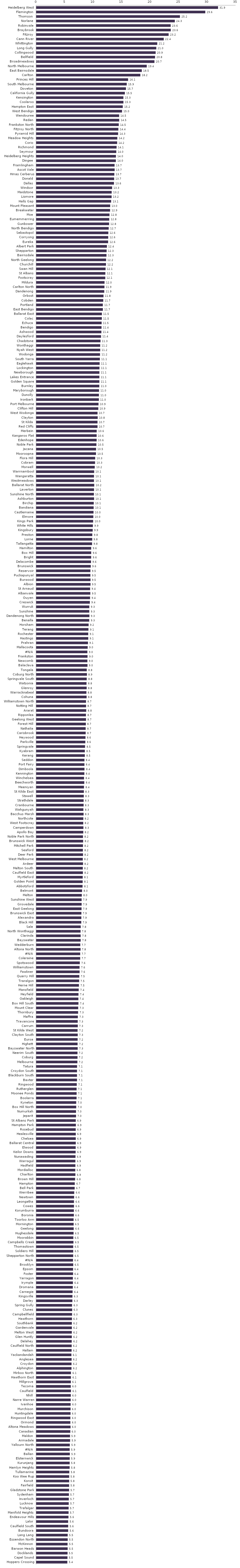
| Category | Series 0 |
|---|---|
| Heidelberg West | 31.882 |
| Flemington | 29.642 |
| Thomson  | 25.197 |
| Norlane | 24.297 |
| Robinvale | 23.571 |
| Braybrook | 23.585 |
| Fitzroy | 23.211 |
| Cann River | 22.353 |
| Whittington | 21.214 |
| Long Gully | 21.045 |
| Collingwood | 20.932 |
| Bellfield | 20.828 |
| Broadmeadows | 20.719 |
| North Melbourne | 19.368 |
| East Bairnsdale | 18.504 |
| Carlton | 18.247 |
| Princes Hill | 16.103 |
| South Melbourne | 15.857 |
| Doveton | 15.722 |
| California Gully | 15.53 |
| Kensington | 15.274 |
| Coolaroo | 15.278 |
| Hampton East | 15.165 |
| West Bendigo | 15.033 |
| Wendouree | 14.53 |
| Redan | 14.538 |
| Frankston North | 14.461 |
| Fitzroy North | 14.388 |
| Pyramid Hill | 14.348 |
| Meadow Heights | 14.203 |
| Corio | 14.177 |
| Richmond | 14.077 |
| Seymour | 14.028 |
| Heidelberg Heights | 13.963 |
| Dingee | 13.953 |
| Framlingham | 13.725 |
| Ascot Vale | 13.741 |
| Hmas Cerberus | 13.684 |
| Donald | 13.652 |
| Dallas | 13.62 |
| Windsor | 13.294 |
| Maidstone | 13.217 |
| Lismore | 13.208 |
| Halls Gap | 13.122 |
| Mount Pleasant | 12.955 |
| Breakwater | 12.939 |
| Moe | 12.833 |
| Eumemmerring | 12.792 |
| Gunbower | 12.766 |
| North Bendigo | 12.694 |
| Sebastopol | 12.63 |
| Corryong | 12.611 |
| Eureka | 12.595 |
| Albert Park | 12.381 |
| Shepparton | 12.33 |
| Bairnsdale | 12.304 |
| North Geelong | 12.238 |
| Churchill | 12.218 |
| Swan Hill | 12.144 |
| St Albans | 12.107 |
| Footscray | 12.096 |
| Mildura | 11.965 |
| Carlton North | 11.949 |
| Dandenong | 11.915 |
| Orbost | 11.783 |
| Cobden | 11.74 |
| Portland | 11.663 |
| East Bendigo | 11.674 |
| Ballarat East | 11.502 |
| Colac | 11.492 |
| Echuca | 11.455 |
| Bendigo | 11.438 |
| Ashwood | 11.411 |
| Daylesford | 11.351 |
| Chadstone | 11.259 |
| Wonthaggi | 11.206 |
| Nyah West | 11.207 |
| Wodonga | 11.173 |
| South Yarra | 11.147 |
| Eaglehawk | 11.106 |
| Lockington | 11.075 |
| Newborough | 11.066 |
| Lakes Entrance | 11.059 |
| Golden Square | 11.057 |
| Burnley | 11.045 |
| Maryborough | 10.999 |
| Dunolly | 10.981 |
| Ironbark | 10.973 |
| Port Melbourne | 10.907 |
| Clifton Hill | 10.869 |
| West Wodonga | 10.734 |
| Clayton | 10.763 |
| St Kilda | 10.73 |
| Red Cliffs | 10.733 |
| Merbein | 10.588 |
| Kangaroo Flat | 10.58 |
| Edenhope | 10.579 |
| Noble Park | 10.54 |
| Jacana | 10.476 |
| Mooroopna | 10.466 |
| Flora Hill | 10.323 |
| Cobram | 10.305 |
| Morwell | 10.247 |
| Warrnambool | 10.147 |
| Wangaratta | 10.117 |
| Westmeadows | 10.113 |
| Ballarat North | 10.156 |
| Laverton | 10.123 |
| Sunshine North | 10.1 |
| Ashburton | 10.134 |
| Birchip | 10.072 |
| Bandiana | 10.056 |
| Castlemaine | 10.032 |
| Elmore | 10 |
| Kings Park | 9.965 |
| White Hills | 9.918 |
| Kingsbury | 9.886 |
| Preston | 9.816 |
| Lorne | 9.807 |
| Tallangatta | 9.778 |
| Hamilton | 9.622 |
| Box Hill | 9.622 |
| Bright | 9.619 |
| Delacombe | 9.592 |
| Brunswick | 9.551 |
| Reservoir | 9.486 |
| Puckapunyal | 9.483 |
| Burwood | 9.506 |
| Albion | 9.505 |
| St Arnaud | 9.436 |
| Albanvale | 9.47 |
| Ouyen | 9.426 |
| Creswick | 9.389 |
| Wurruk | 9.291 |
| Sunshine | 9.286 |
| Dandenong North | 9.312 |
| Benalla | 9.28 |
| Horsham | 9.173 |
| Terang | 9.142 |
| Rochester | 9.105 |
| Hastings | 9.109 |
| Prahran | 9.06 |
| Mallacoota | 9.006 |
| #N/A | 8.952 |
| Frankston | 8.982 |
| Newcomb | 8.955 |
| Balaclava | 8.974 |
| Tongala | 8.844 |
| Coburg North | 8.877 |
| Springvale South | 8.84 |
| Watsonia | 8.801 |
| Glenroy | 8.829 |
| Warracknabeal | 8.782 |
| Cohuna | 8.818 |
| Williamstown North | 8.716 |
| Notting Hill | 8.725 |
| Ararat | 8.754 |
| Ripponlea | 8.702 |
| Geelong West | 8.715 |
| Forest Hill | 8.686 |
| Nathalia | 8.653 |
| Carisbrook | 8.656 |
| Heywood | 8.623 |
| Parkville | 8.595 |
| Springvale | 8.549 |
| Kyabram | 8.509 |
| Kerang | 8.508 |
| Seddon | 8.441 |
| Port Fairy | 8.439 |
| Dimboola | 8.447 |
| Kennington | 8.428 |
| Winchelsea | 8.369 |
| Beechworth | 8.412 |
| Meeniyan | 8.36 |
| St Kilda East | 8.339 |
| Stawell | 8.324 |
| Strathdale | 8.294 |
| Cranbourne | 8.295 |
| Wahgunyah | 8.255 |
| Bacchus Marsh | 8.291 |
| Northcote | 8.248 |
| West Footscray | 8.231 |
| Camperdown | 8.261 |
| Apollo Bay | 8.238 |
| Noble Park North | 8.185 |
| Brunswick West | 8.211 |
| Mitchell Park | 8.182 |
| Seaford | 8.165 |
| Deer Park | 8.19 |
| West Melbourne | 8.15 |
| Ardeer | 8.192 |
| Melton South | 8.153 |
| Caulfield East | 8.171 |
| Myrtleford | 8.136 |
| Golden Point | 8.127 |
| Abbotsford | 8.109 |
| Belmont | 8.023 |
| Melton | 7.977 |
| Sunshine West | 7.944 |
| Grovedale | 7.945 |
| East Geelong | 7.934 |
| Brunswick East | 7.904 |
| Alexandra | 7.897 |
| Black Hill | 7.882 |
| Sale | 7.791 |
| North Wonthaggi | 7.761 |
| Clarinda | 7.774 |
| Bayswater | 7.777 |
| Wedderburn | 7.711 |
| Altona North | 7.759 |
| #N/A | 7.695 |
| Coleraine | 7.692 |
| Spotswood | 7.627 |
| Williamstown | 7.58 |
| Fawkner | 7.591 |
| Quarry Hill | 7.54 |
| Traralgon | 7.512 |
| Herne Hill | 7.475 |
| Mansfield | 7.433 |
| Heyfield | 7.393 |
| Oakleigh | 7.374 |
| Box Hill South | 7.387 |
| Mount Clear | 7.344 |
| Thornbury | 7.328 |
| Maffra | 7.285 |
| Travancore | 7.259 |
| Carrum | 7.275 |
| St Kilda West | 7.233 |
| Clayton South | 7.264 |
| Euroa | 7.244 |
| Highett | 7.235 |
| Bayswater North | 7.255 |
| Neerim South | 7.218 |
| Coburg | 7.224 |
| Melbourne | 7.201 |
| Tatura | 7.143 |
| Croydon South | 7.135 |
| Blackburn South | 7.134 |
| Baxter | 7.135 |
| Ringwood | 7.093 |
| Rutherglen | 7.061 |
| Moonee Ponds | 7.066 |
| Boolarra | 7.056 |
| Kyneton | 6.994 |
| Box Hill North | 6.997 |
| Numurkah | 6.963 |
| Jeparit | 6.965 |
| St Albans Park | 6.918 |
| Hampton Park | 6.938 |
| Rosebud | 6.905 |
| Healesville | 6.919 |
| Chelsea | 6.915 |
| Ballarat Central | 6.919 |
| Elwood | 6.901 |
| Keilor Downs | 6.893 |
| Nunawading | 6.869 |
| Warragul | 6.851 |
| Hadfield | 6.852 |
| Mordialloc | 6.83 |
| Charlton | 6.852 |
| Brown Hill | 6.802 |
| Hampton | 6.745 |
| Bell Park | 6.726 |
| Werribee | 6.647 |
| Newtown | 6.63 |
| Leongatha | 6.603 |
| Cowes | 6.606 |
| Korumburra | 6.585 |
| Boronia | 6.585 |
| Toorloo Arm | 6.536 |
| Mornington | 6.546 |
| Geelong | 6.557 |
| Hughesdale | 6.532 |
| Moorabbin | 6.495 |
| Campbells Creek | 6.511 |
| Thomastown | 6.469 |
| Soldiers Hill | 6.47 |
| Shepparton North | 6.469 |
| #N/A | 6.43 |
| Brooklyn | 6.475 |
| Epsom | 6.448 |
| Foster | 6.444 |
| Yarragon | 6.409 |
| Irymple | 6.418 |
| Dromana | 6.399 |
| Carnegie | 6.36 |
| Kingsville | 6.337 |
| Darley | 6.326 |
| Spring Gully | 6.265 |
| Clunes | 6.289 |
| Campbellfield | 6.27 |
| Hawthorn | 6.253 |
| Southbank | 6.23 |
| Gardenvale | 6.236 |
| Melton West | 6.224 |
| Glen Huntly | 6.225 |
| Delahey | 6.208 |
| Caulfield North | 6.201 |
| Hallam | 6.187 |
| Yackandandah | 6.15 |
| Anglesea | 6.191 |
| Croydon | 6.172 |
| Alphington | 6.169 |
| Mirboo North | 6.071 |
| Hawthorn East | 6.067 |
| Millgrove | 6.056 |
| Tecoma | 6.041 |
| Caulfield | 6.076 |
| Nhill | 6.048 |
| Narre Warren | 6.028 |
| Ivanhoe | 6.015 |
| Murchison | 6.005 |
| Huntingdale | 6 |
| Ringwood East | 5.97 |
| Ormond | 5.969 |
| Altona Meadows | 6.004 |
| Canadian | 5.961 |
| Maldon | 5.912 |
| Armadale | 5.926 |
| Yallourn North | 5.872 |
| #N/A | 5.852 |
| Ballan | 5.878 |
| Elsternwick | 5.86 |
| Kurunjang | 5.849 |
| Hamlyn Heights | 5.84 |
| Tullamarine | 5.785 |
| Koo Wee Rup | 5.762 |
| Koroit | 5.76 |
| Fairfield | 5.753 |
| Gladstone Park | 5.746 |
| Sydenham | 5.716 |
| Inverloch | 5.696 |
| Lucknow | 5.682 |
| Trafalgar | 5.664 |
| Manifold Heights | 5.655 |
| Endeavour Hills | 5.635 |
| Lalor | 5.582 |
| Caulfield South | 5.588 |
| Bundoora | 5.587 |
| Lang Lang | 5.498 |
| Essendon North | 5.503 |
| McKinnon | 5.477 |
| Barwon Heads | 5.493 |
| Docklands | 5.475 |
| Capel Sound | 5.462 |
| Hoppers Crossing | 5.435 |